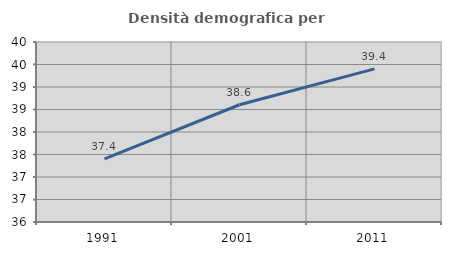
| Category | Densità demografica |
|---|---|
| 1991.0 | 37.404 |
| 2001.0 | 38.606 |
| 2011.0 | 39.403 |